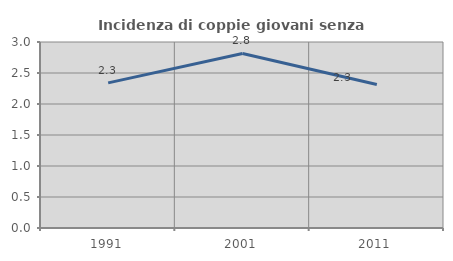
| Category | Incidenza di coppie giovani senza figli |
|---|---|
| 1991.0 | 2.341 |
| 2001.0 | 2.815 |
| 2011.0 | 2.313 |